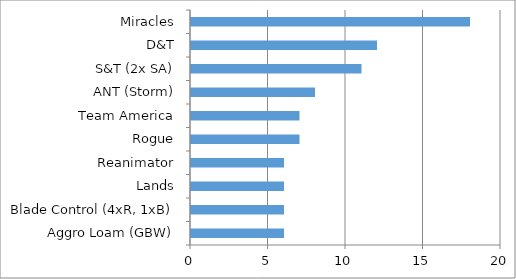
| Category | Series 0 |
|---|---|
| Aggro Loam (GBW) | 6 |
| Blade Control (4xR, 1xB) | 6 |
| Lands | 6 |
| Reanimator | 6 |
| Rogue | 7 |
| Team America | 7 |
| ANT (Storm) | 8 |
| S&T (2x SA) | 11 |
| D&T | 12 |
| Miracles | 18 |